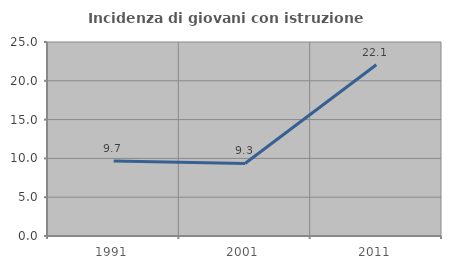
| Category | Incidenza di giovani con istruzione universitaria |
|---|---|
| 1991.0 | 9.664 |
| 2001.0 | 9.35 |
| 2011.0 | 22.066 |